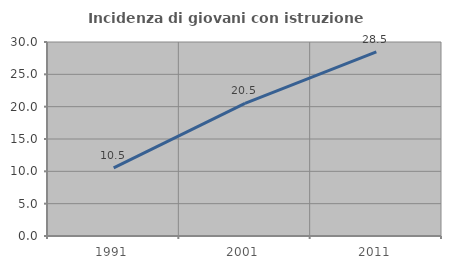
| Category | Incidenza di giovani con istruzione universitaria |
|---|---|
| 1991.0 | 10.526 |
| 2001.0 | 20.506 |
| 2011.0 | 28.484 |